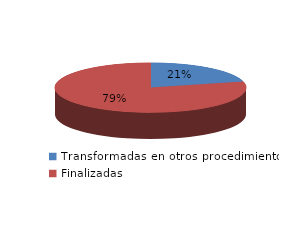
| Category | Series 0 |
|---|---|
| Transformadas en otros procedimientos | 10277 |
| Finalizadas | 38746 |